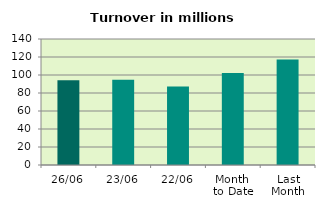
| Category | Series 0 |
|---|---|
| 26/06 | 94.237 |
| 23/06 | 94.755 |
| 22/06 | 87.167 |
| Month 
to Date | 102.146 |
| Last
Month | 117.306 |